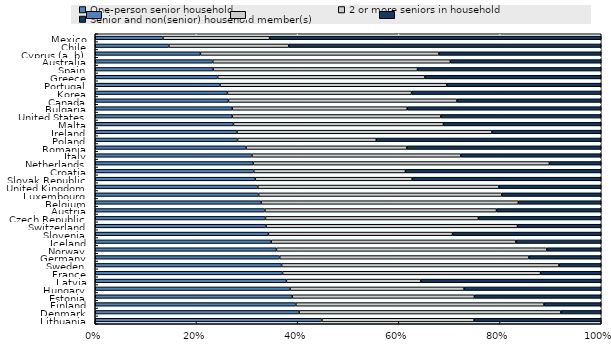
| Category | One-person senior household | 2 or more seniors in household | Senior and non(senior) household member(s) |
|---|---|---|---|
| Lithuania | 0.448 | 0.301 | 0.251 |
| Denmark | 0.403 | 0.517 | 0.08 |
| Finland | 0.396 | 0.49 | 0.113 |
| Estonia | 0.389 | 0.36 | 0.251 |
| Hungary | 0.385 | 0.344 | 0.271 |
| Latvia | 0.378 | 0.266 | 0.357 |
| France | 0.37 | 0.51 | 0.12 |
| Sweden | 0.368 | 0.548 | 0.083 |
| Germany | 0.364 | 0.493 | 0.143 |
| Norway | 0.358 | 0.534 | 0.108 |
| Iceland | 0.348 | 0.484 | 0.169 |
| Slovenia | 0.342 | 0.364 | 0.294 |
| Switzerland | 0.338 | 0.497 | 0.166 |
| Czech Republic | 0.336 | 0.421 | 0.243 |
| Austria | 0.335 | 0.458 | 0.207 |
| Belgium | 0.328 | 0.508 | 0.164 |
| Luxembourg | 0.323 | 0.481 | 0.197 |
| United Kingdom | 0.321 | 0.477 | 0.202 |
| Slovak Republic | 0.316 | 0.31 | 0.374 |
| Croatia | 0.313 | 0.3 | 0.387 |
| Netherlands | 0.312 | 0.585 | 0.103 |
| Italy | 0.31 | 0.413 | 0.277 |
| Romania | 0.298 | 0.318 | 0.384 |
| Poland | 0.281 | 0.274 | 0.445 |
| Ireland | 0.28 | 0.504 | 0.216 |
| Malta | 0.273 | 0.415 | 0.312 |
| United States | 0.271 | 0.412 | 0.317 |
| Bulgaria | 0.271 | 0.346 | 0.383 |
| Canada | 0.263 | 0.452 | 0.285 |
| Korea | 0.261 | 0.364 | 0.375 |
| Portugal | 0.247 | 0.448 | 0.305 |
| Greece | 0.242 | 0.41 | 0.348 |
| Spain | 0.233 | 0.404 | 0.363 |
| Australia | 0.232 | 0.47 | 0.298 |
| Cyprus (a, b) | 0.208 | 0.472 | 0.321 |
| Chile | 0.146 | 0.237 | 0.618 |
| Mexico | 0.134 | 0.211 | 0.656 |